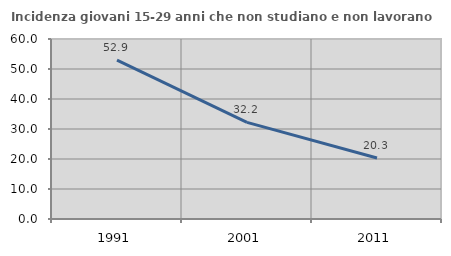
| Category | Incidenza giovani 15-29 anni che non studiano e non lavorano  |
|---|---|
| 1991.0 | 52.941 |
| 2001.0 | 32.195 |
| 2011.0 | 20.339 |